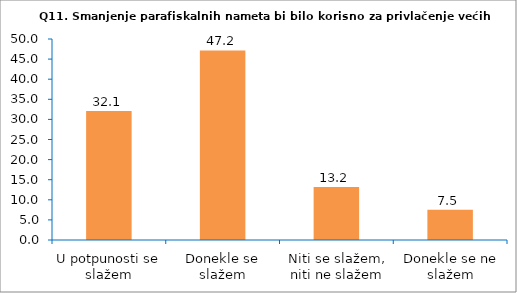
| Category | Series 0 |
|---|---|
| U potpunosti se slažem | 32.075 |
| Donekle se slažem | 47.17 |
| Niti se slažem, niti ne slažem | 13.208 |
| Donekle se ne slažem | 7.547 |